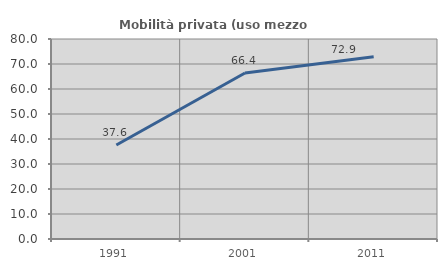
| Category | Mobilità privata (uso mezzo privato) |
|---|---|
| 1991.0 | 37.624 |
| 2001.0 | 66.379 |
| 2011.0 | 72.881 |